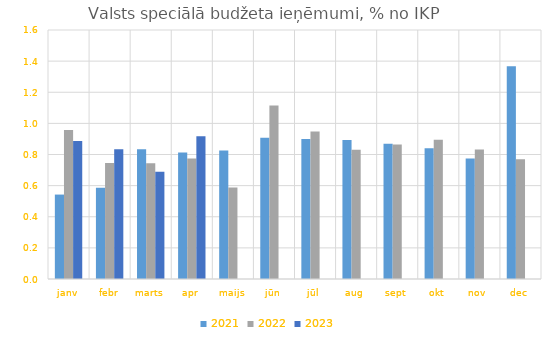
| Category | 2021 | 2022 | 2023 |
|---|---|---|---|
| janv | 0.543 | 0.957 | 0.886 |
| febr | 0.586 | 0.745 | 0.834 |
| marts | 0.834 | 0.744 | 0.689 |
| apr | 0.813 | 0.774 | 0.917 |
| maijs | 0.826 | 0.588 | 0 |
| jūn | 0.908 | 1.116 | 0 |
| jūl | 0.9 | 0.949 | 0 |
| aug | 0.892 | 0.83 | 0 |
| sept | 0.87 | 0.865 | 0 |
| okt | 0.841 | 0.895 | 0 |
| nov | 0.775 | 0.832 | 0 |
| dec | 1.366 | 0.77 | 0 |